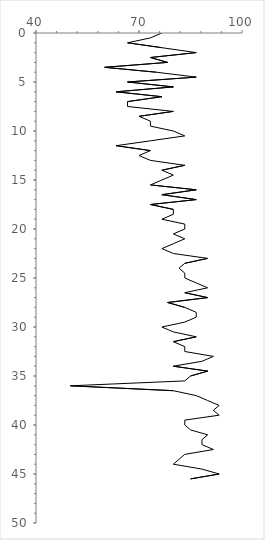
| Category | Series 0 |
|---|---|
| 76.66666666666666 | 0 |
| 73.33333333333333 | 0.5 |
| 66.66666666666667 | 1 |
| 76.66666666666667 | 1.5 |
| 86.66666666666667 | 2 |
| 73.33333333333333 | 2.5 |
| 78.33333333333333 | 3 |
| 59.99999999999999 | 3.5 |
| 75.0 | 4 |
| 86.66666666666667 | 4.5 |
| 66.66666666666667 | 5 |
| 80.0 | 5.5 |
| 63.33333333333333 | 6 |
| 76.66666666666667 | 6.5 |
| 66.66666666666667 | 7 |
| 66.66666666666667 | 7.5 |
| 80.0 | 8 |
| 70.0 | 8.5 |
| 73.33333333333333 | 9 |
| 73.33333333333333 | 9.5 |
| 80.0 | 10 |
| 83.33333333333334 | 10.5 |
| 73.33333333333333 | 11 |
| 63.33333333333333 | 11.5 |
| 73.33333333333333 | 12 |
| 70.0 | 12.5 |
| 73.33333333333333 | 13 |
| 83.33333333333334 | 13.5 |
| 76.66666666666667 | 14 |
| 80.0 | 14.5 |
| 76.66666666666667 | 15 |
| 73.33333333333333 | 15.5 |
| 86.66666666666667 | 16 |
| 76.66666666666667 | 16.5 |
| 86.66666666666667 | 17 |
| 73.33333333333333 | 17.5 |
| 80.0 | 18 |
| 80.0 | 18.5 |
| 76.66666666666667 | 19 |
| 83.33333333333334 | 19.5 |
| 83.33333333333334 | 20 |
| 80.0 | 20.5 |
| 83.33333333333334 | 21 |
| 80.0 | 21.5 |
| 76.66666666666667 | 22 |
| 80.0 | 22.5 |
| 90.0 | 23 |
| 83.33333333333334 | 23.5 |
| 81.66666666666666 | 24 |
| 83.33333333333334 | 24.5 |
| 83.33333333333334 | 25 |
| 86.66666666666667 | 25.5 |
| 90.0 | 26 |
| 83.33333333333334 | 26.5 |
| 90.0 | 27 |
| 78.33333333333333 | 27.5 |
| 83.33333333333334 | 28 |
| 86.66666666666667 | 28.5 |
| 86.66666666666667 | 29 |
| 83.33333333333334 | 29.5 |
| 76.66666666666666 | 30 |
| 80.0 | 30.5 |
| 86.66666666666667 | 31 |
| 80.0 | 31.5 |
| 83.33333333333334 | 32 |
| 83.33333333333334 | 32.5 |
| 91.66666666666667 | 33 |
| 88.33333333333333 | 33.5 |
| 80.0 | 34 |
| 90.0 | 34.5 |
| 85.0 | 35 |
| 83.33333333333334 | 35.5 |
| 50.0 | 36 |
| 80.0 | 36.5 |
| 86.66666666666667 | 37 |
| 90.0 | 37.5 |
| 93.33333333333333 | 38 |
| 91.66666666666667 | 38.5 |
| 93.33333333333333 | 39 |
| 83.33333333333334 | 39.5 |
| 83.33333333333334 | 40 |
| 85.0 | 40.5 |
| 90.0 | 41 |
| 88.33333333333333 | 41.5 |
| 88.33333333333333 | 42 |
| 91.66666666666667 | 42.5 |
| 83.33333333333334 | 43 |
| 81.66666666666666 | 43.5 |
| 80.0 | 44 |
| 88.33333333333333 | 44.5 |
| 93.33333333333333 | 45 |
| 85.0 | 45.5 |